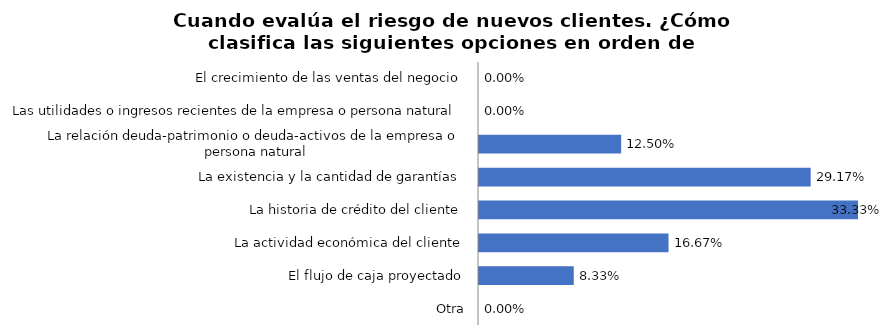
| Category | Series 0 |
|---|---|
| El crecimiento de las ventas del negocio | 0 |
| Las utilidades o ingresos recientes de la empresa o persona natural | 0 |
| La relación deuda-patrimonio o deuda-activos de la empresa o persona natural | 0.125 |
| La existencia y la cantidad de garantías | 0.292 |
| La historia de crédito del cliente | 0.333 |
| La actividad económica del cliente | 0.167 |
| El flujo de caja proyectado | 0.083 |
| Otra | 0 |